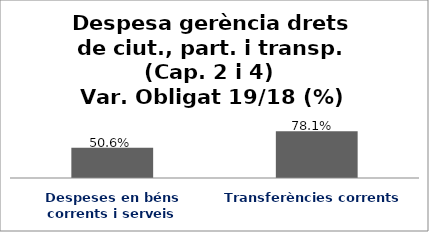
| Category | Series 0 |
|---|---|
| Despeses en béns corrents i serveis | 0.506 |
| Transferències corrents | 0.781 |